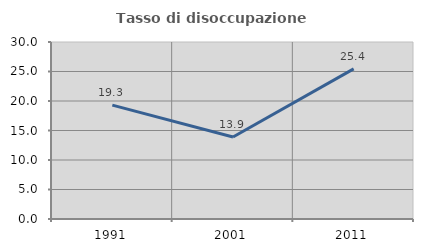
| Category | Tasso di disoccupazione giovanile  |
|---|---|
| 1991.0 | 19.298 |
| 2001.0 | 13.904 |
| 2011.0 | 25.439 |